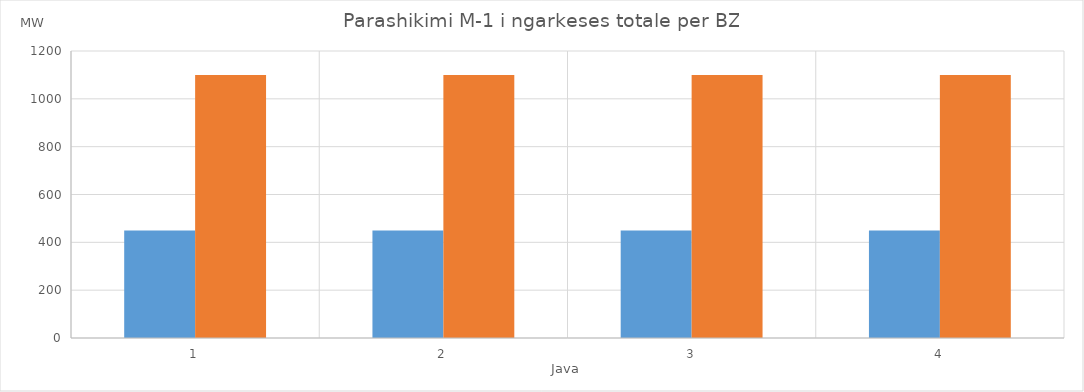
| Category | Min (MW) | Max (MW) |
|---|---|---|
| 0 | 450 | 1100 |
| 1 | 450 | 1100 |
| 2 | 450 | 1100 |
| 3 | 450 | 1100 |